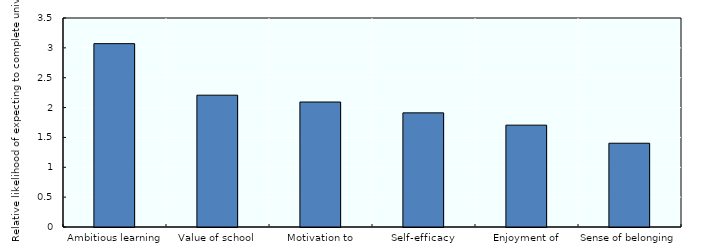
| Category | Series 0 |
|---|---|
| Ambitious learning goals | 3.07 |
| Value of school | 2.208 |
| Motivation to master tasks | 2.093 |
| Self-efficacy | 1.911 |
| Enjoyment of reading | 1.706 |
| Sense of belonging | 1.403 |